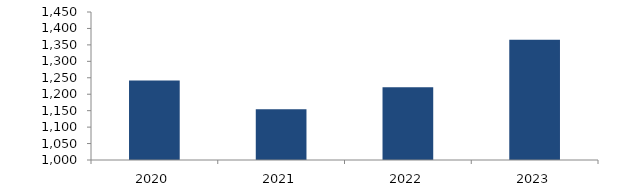
| Category | Bogotá |
|---|---|
| 2020.0 | 1241.88 |
| 2021.0 | 1154.669 |
| 2022.0 | 1221.202 |
| 2023.0 | 1365.921 |